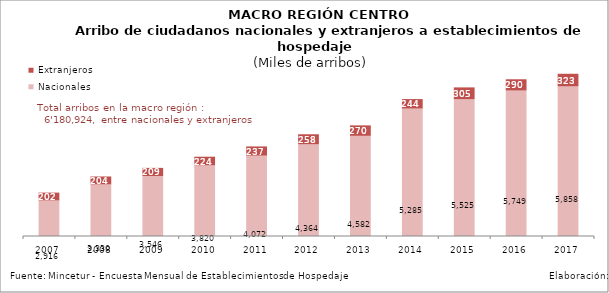
| Category | Nacionales | Extranjeros |
|---|---|---|
| 2007.0 | 2916.263 | 201.835 |
| 2008.0 | 3329.525 | 204.237 |
| 2009.0 | 3546.382 | 209.181 |
| 2010.0 | 3819.887 | 224.02 |
| 2011.0 | 4071.783 | 236.877 |
| 2012.0 | 4364.153 | 257.975 |
| 2013.0 | 4581.634 | 269.886 |
| 2014.0 | 5285.093 | 243.999 |
| 2015.0 | 5524.994 | 305.13 |
| 2016.0 | 5749.387 | 289.947 |
| 2017.0 | 5857.528 | 323.396 |